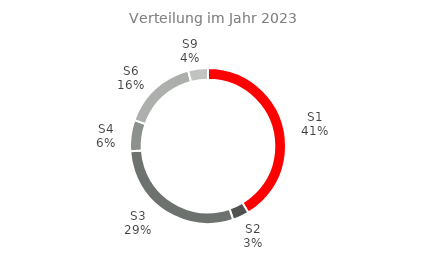
| Category | Series 0 |
|---|---|
| S1 | 0.413 |
| S2 | 0.034 |
| S3 | 0.292 |
| S4 | 0.065 |
| S6 | 0.155 |
| S9 | 0.041 |